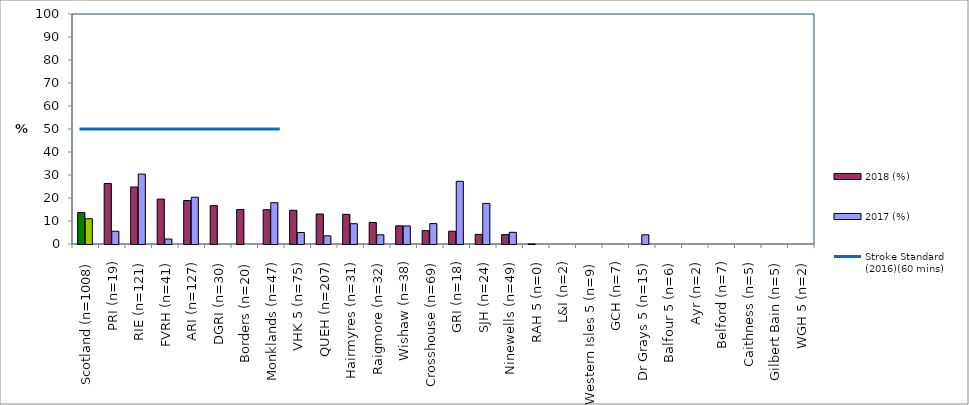
| Category | 2018 (%) | 2017 (%) |
|---|---|---|
| Scotland (n=1008) | 13.69 | 10.993 |
| PRI (n=19) | 26.316 | 5.556 |
| RIE (n=121) | 24.793 | 30.4 |
| FVRH (n=41) | 19.512 | 2.174 |
| ARI (n=127) | 18.898 | 20.325 |
| DGRI (n=30) | 16.667 | 0 |
| Borders (n=20) | 15 | 0 |
| Monklands (n=47) | 14.894 | 17.949 |
| VHK 5 (n=75) | 14.667 | 5 |
| QUEH (n=207) | 13.043 | 3.553 |
| Hairmyres (n=31) | 12.903 | 8.824 |
| Raigmore (n=32) | 9.375 | 4 |
| Wishaw (n=38) | 7.895 | 7.843 |
| Crosshouse (n=69) | 5.797 | 8.861 |
| GRI (n=18) | 5.556 | 27.273 |
| SJH (n=24) | 4.167 | 17.647 |
| Ninewells (n=49) | 4.082 | 5.085 |
| RAH 5 (n=0) | 0 | 0 |
| L&I (n=2) | 0 | 0 |
| Western Isles 5 (n=9) | 0 | 0 |
| GCH (n=7) | 0 | 0 |
| Dr Grays 5 (n=15) | 0 | 4 |
| Balfour 5 (n=6) | 0 | 0 |
| Ayr (n=2) | 0 | 0 |
| Belford (n=7) | 0 | 0 |
| Caithness (n=5) | 0 | 0 |
| Gilbert Bain (n=5) | 0 | 0 |
| WGH 5 (n=2) | 0 | 0 |